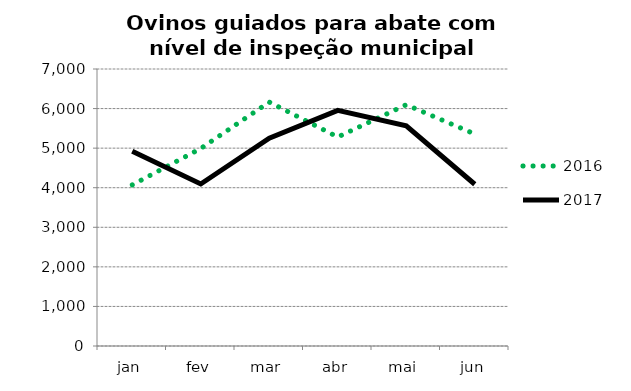
| Category | 2016 | 2017 |
|---|---|---|
| jan | 4071 | 4920 |
| fev | 4991 | 4094 |
| mar | 6164 | 5249 |
| abr | 5281 | 5953 |
| mai | 6097 | 5564 |
| jun | 5357 | 4087 |